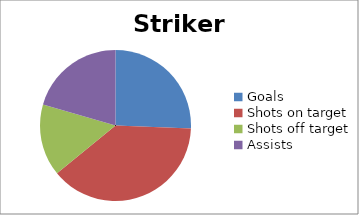
| Category | Striker 5 |
|---|---|
| Goals | 10 |
| Shots on target | 15 |
| Shots off target | 6 |
| Assists | 8 |